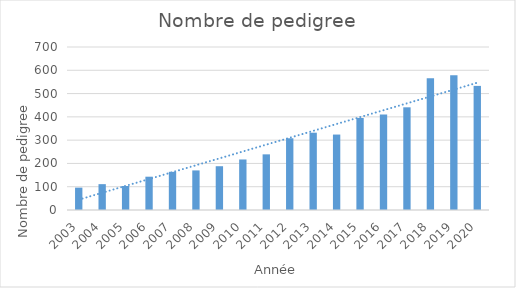
| Category | Series 0 |
|---|---|
| 2003.0 | 96 |
| 2004.0 | 111 |
| 2005.0 | 103 |
| 2006.0 | 143 |
| 2007.0 | 164 |
| 2008.0 | 170 |
| 2009.0 | 188 |
| 2010.0 | 217 |
| 2011.0 | 239 |
| 2012.0 | 308 |
| 2013.0 | 332 |
| 2014.0 | 324 |
| 2015.0 | 395 |
| 2016.0 | 410 |
| 2017.0 | 441 |
| 2018.0 | 566 |
| 2019.0 | 579 |
| 2020.0 | 533 |